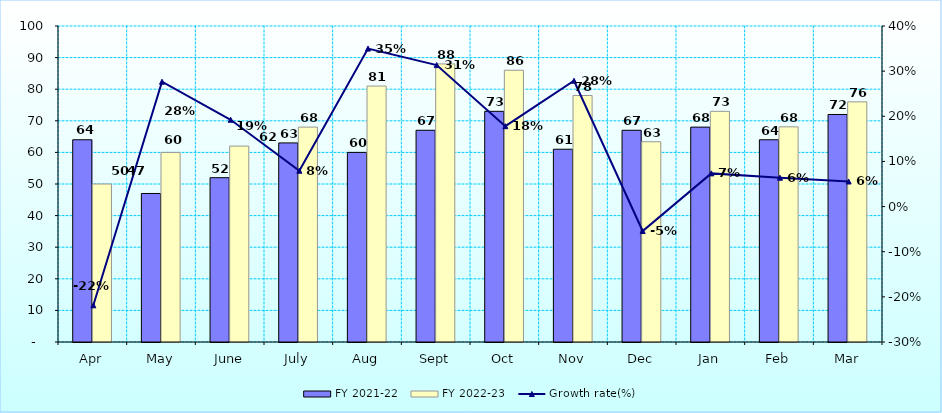
| Category | FY 2021-22 | FY 2022-23 |
|---|---|---|
| Apr | 64 | 50 |
| May | 47 | 60 |
| June | 52 | 62 |
| July | 63 | 68 |
| Aug | 60 | 81 |
| Sept | 67 | 88 |
| Oct | 73 | 86 |
| Nov | 61 | 78 |
| Dec | 67 | 63.37 |
| Jan | 68 | 73 |
| Feb | 64 | 68.092 |
| Mar | 72 | 76 |